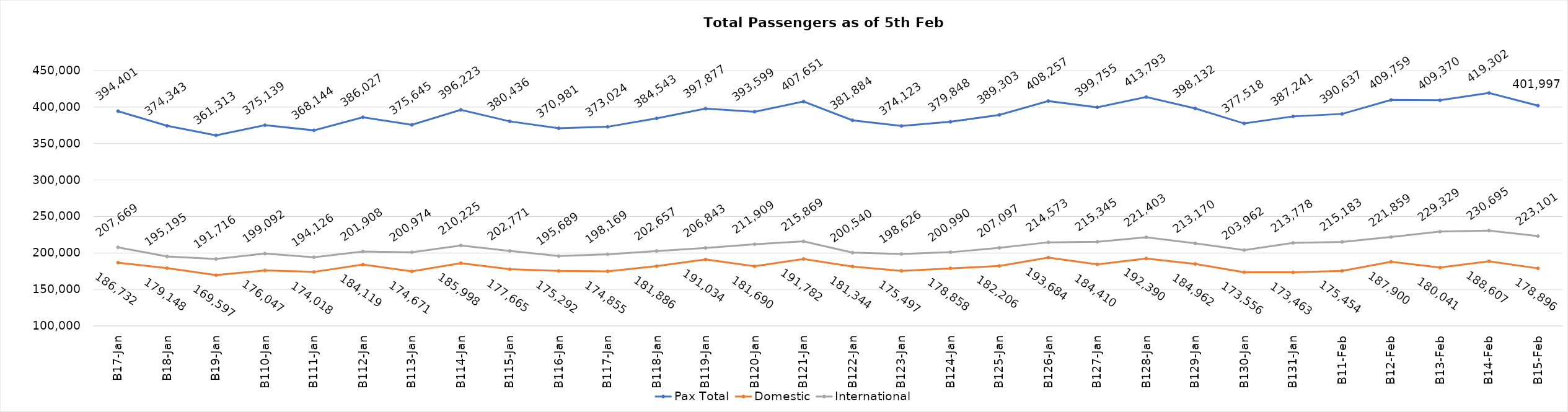
| Category | Pax Total | Domestic | International |
|---|---|---|---|
| 2024-01-07 | 394401 | 186732 | 207669 |
| 2024-01-08 | 374343 | 179148 | 195195 |
| 2024-01-09 | 361313 | 169597 | 191716 |
| 2024-01-10 | 375139 | 176047 | 199092 |
| 2024-01-11 | 368144 | 174018 | 194126 |
| 2024-01-12 | 386027 | 184119 | 201908 |
| 2024-01-13 | 375645 | 174671 | 200974 |
| 2024-01-14 | 396223 | 185998 | 210225 |
| 2024-01-15 | 380436 | 177665 | 202771 |
| 2024-01-16 | 370981 | 175292 | 195689 |
| 2024-01-17 | 373024 | 174855 | 198169 |
| 2024-01-18 | 384543 | 181886 | 202657 |
| 2024-01-19 | 397877 | 191034 | 206843 |
| 2024-01-20 | 393599 | 181690 | 211909 |
| 2024-01-21 | 407651 | 191782 | 215869 |
| 2024-01-22 | 381884 | 181344 | 200540 |
| 2024-01-23 | 374123 | 175497 | 198626 |
| 2024-01-24 | 379848 | 178858 | 200990 |
| 2024-01-25 | 389303 | 182206 | 207097 |
| 2024-01-26 | 408257 | 193684 | 214573 |
| 2024-01-27 | 399755 | 184410 | 215345 |
| 2024-01-28 | 413793 | 192390 | 221403 |
| 2024-01-29 | 398132 | 184962 | 213170 |
| 2024-01-30 | 377518 | 173556 | 203962 |
| 2024-01-31 | 387241 | 173463 | 213778 |
| 2024-02-01 | 390637 | 175454 | 215183 |
| 2024-02-02 | 409759 | 187900 | 221859 |
| 2024-02-03 | 409370 | 180041 | 229329 |
| 2024-02-04 | 419302 | 188607 | 230695 |
| 2024-02-05 | 401997 | 178896 | 223101 |